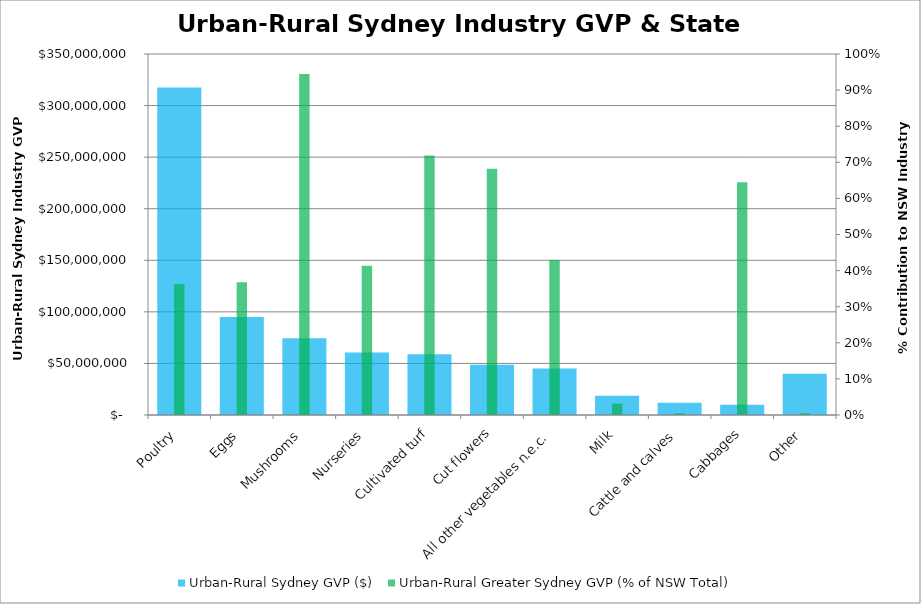
| Category | Urban-Rural Sydney GVP ($) |
|---|---|
| Poultry | 317434917.65 |
| Eggs | 95007529.44 |
| Mushrooms | 74316508.67 |
| Nurseries | 60691409.51 |
| Cultivated turf | 58850707.26 |
| Cut flowers | 48619655.36 |
| All other vegetables n.e.c. | 45148531.6 |
| Milk | 18653133.61 |
| Cattle and calves | 11894795.74 |
| Cabbages | 9918090.17 |
| Other | 40032638.64 |